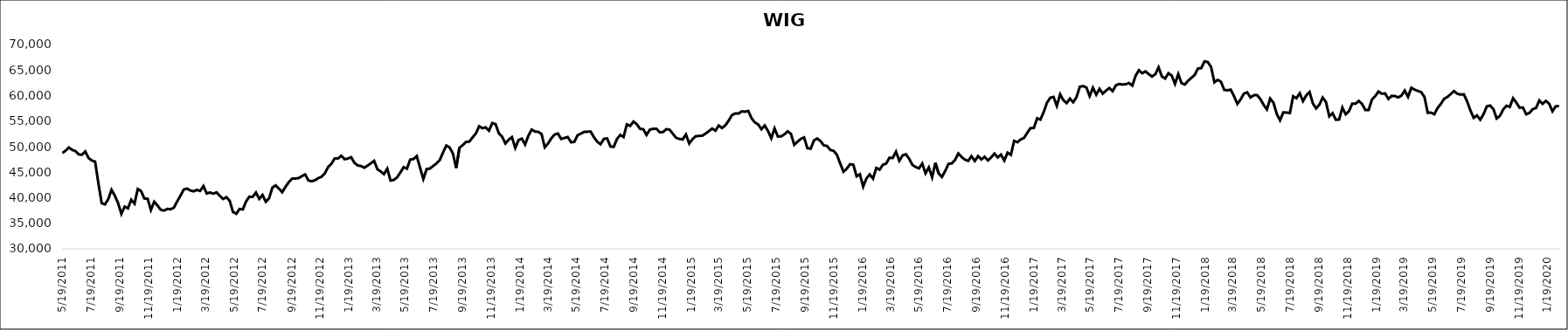
| Category | WIG |
|---|---|
| 5/19/11 | 48747.55 |
| 5/26/11 | 49215.53 |
| 6/2/11 | 49824.93 |
| 6/9/11 | 49378.82 |
| 6/16/11 | 49129.21 |
| 6/23/11 | 48485.26 |
| 6/30/11 | 48414.36 |
| 7/7/11 | 49057.05 |
| 7/14/11 | 47768.38 |
| 7/21/11 | 47291.31 |
| 7/28/11 | 47071.4 |
| 8/4/11 | 42828.22 |
| 8/11/11 | 38934.71 |
| 8/18/11 | 38697.56 |
| 8/25/11 | 39715.27 |
| 9/1/11 | 41553.09 |
| 9/8/11 | 40405.17 |
| 9/15/11 | 38945 |
| 9/22/11 | 36851.2 |
| 9/29/11 | 38264.32 |
| 10/6/11 | 37915.03 |
| 10/13/11 | 39608.13 |
| 10/20/11 | 38835.92 |
| 10/27/11 | 41708.88 |
| 11/3/11 | 41313.92 |
| 11/10/11 | 39853.18 |
| 11/17/11 | 39797.19 |
| 11/24/11 | 37607.27 |
| 12/1/11 | 39215.21 |
| 12/8/11 | 38474.28 |
| 12/15/11 | 37637.47 |
| 12/22/11 | 37478.7 |
| 12/29/11 | 37814.52 |
| 1/5/12 | 37739.39 |
| 1/12/12 | 38062.87 |
| 1/19/12 | 39288.13 |
| 1/26/12 | 40392.48 |
| 2/2/12 | 41602.24 |
| 2/9/12 | 41792.46 |
| 2/16/12 | 41430.3 |
| 2/23/12 | 41258.14 |
| 3/1/12 | 41533.87 |
| 3/8/12 | 41337.97 |
| 3/15/12 | 42281.33 |
| 3/22/12 | 40834.43 |
| 3/29/12 | 41028.06 |
| 4/5/12 | 40802.41 |
| 4/12/12 | 41053.82 |
| 4/19/12 | 40354.53 |
| 4/26/12 | 39761.78 |
| 5/3/12 | 40114.73 |
| 5/10/12 | 39404.16 |
| 5/17/12 | 37228.88 |
| 5/24/12 | 36852.75 |
| 5/31/12 | 37793.58 |
| 6/7/12 | 37707.25 |
| 6/14/12 | 39286.64 |
| 6/21/12 | 40207.61 |
| 6/28/12 | 40165.34 |
| 7/5/12 | 41013.96 |
| 7/12/12 | 39778.1 |
| 7/19/12 | 40545.64 |
| 7/26/12 | 39213.05 |
| 8/2/12 | 39876.95 |
| 8/9/12 | 41976.63 |
| 8/16/12 | 42408.41 |
| 8/23/12 | 41795.63 |
| 8/30/12 | 41077.44 |
| 9/6/12 | 42134.93 |
| 9/13/12 | 43047.41 |
| 9/20/12 | 43737.02 |
| 9/27/12 | 43763.3 |
| 10/4/12 | 43840.23 |
| 10/11/12 | 44224.67 |
| 10/18/12 | 44550.12 |
| 10/25/12 | 43374.6 |
| 11/1/12 | 43232.44 |
| 11/8/12 | 43429.42 |
| 11/15/12 | 43845.94 |
| 11/22/12 | 44121.53 |
| 11/29/12 | 44787.84 |
| 12/6/12 | 46019.97 |
| 12/13/12 | 46653.84 |
| 12/20/12 | 47701.82 |
| 12/27/12 | 47673.03 |
| 1/3/13 | 48222.72 |
| 1/10/13 | 47546.91 |
| 1/17/13 | 47661.37 |
| 1/24/13 | 47942.04 |
| 1/31/13 | 46840.15 |
| 2/7/13 | 46329.66 |
| 2/14/13 | 46211.54 |
| 2/21/13 | 45879.9 |
| 2/28/13 | 46280.36 |
| 3/7/13 | 46745.26 |
| 3/14/13 | 47223.68 |
| 3/21/13 | 45580.47 |
| 3/28/13 | 45147.57 |
| 4/4/13 | 44623.89 |
| 4/11/13 | 45688.48 |
| 4/18/13 | 43364.7 |
| 4/25/13 | 43482.18 |
| 5/2/13 | 43991.51 |
| 5/9/13 | 44943.16 |
| 5/16/13 | 45992.03 |
| 5/23/13 | 45687.76 |
| 5/30/13 | 47476.64 |
| 6/6/13 | 47573.66 |
| 6/13/13 | 48152.82 |
| 6/20/13 | 45870 |
| 6/27/13 | 43667.37 |
| 7/4/13 | 45613.75 |
| 7/11/13 | 45712.72 |
| 7/18/13 | 46221.23 |
| 7/25/13 | 46713.02 |
| 8/1/13 | 47370.81 |
| 8/8/13 | 48862.88 |
| 8/15/13 | 50223.95 |
| 8/22/13 | 49846.48 |
| 8/29/13 | 48676.45 |
| 9/5/13 | 45830.66 |
| 9/12/13 | 49771.55 |
| 9/19/13 | 50300.53 |
| 9/26/13 | 50936.34 |
| 10/3/13 | 50982.03 |
| 10/10/13 | 51806.83 |
| 10/17/13 | 52573.59 |
| 10/24/13 | 53994.46 |
| 10/31/13 | 53607.86 |
| 11/7/13 | 53785.07 |
| 11/14/13 | 53127.16 |
| 11/21/13 | 54621.21 |
| 11/28/13 | 54420.19 |
| 12/5/13 | 52597.13 |
| 12/12/13 | 51947.96 |
| 12/19/13 | 50631.75 |
| 12/26/13 | 51362.3 |
| 1/2/14 | 51865.89 |
| 1/9/14 | 49753.03 |
| 1/16/14 | 51288.7 |
| 1/23/14 | 51569.21 |
| 1/30/14 | 50417.17 |
| 2/6/14 | 52138.87 |
| 2/13/14 | 53349.65 |
| 2/20/14 | 52967.02 |
| 2/27/14 | 52906.04 |
| 3/6/14 | 52487.84 |
| 3/13/14 | 49878.65 |
| 3/20/14 | 50627.71 |
| 3/27/14 | 51642.99 |
| 4/3/14 | 52376.18 |
| 4/10/14 | 52580.73 |
| 4/17/14 | 51510.98 |
| 4/24/14 | 51705.76 |
| 5/1/14 | 51892.77 |
| 5/8/14 | 50851.25 |
| 5/15/14 | 50944.5 |
| 5/22/14 | 52244.13 |
| 5/29/14 | 52553.48 |
| 6/5/14 | 52901.29 |
| 6/12/14 | 52927.91 |
| 6/19/14 | 52937.45 |
| 6/26/14 | 51815.43 |
| 7/3/14 | 50951.73 |
| 7/10/14 | 50474.36 |
| 7/17/14 | 51527.37 |
| 7/24/14 | 51613.47 |
| 7/31/14 | 50037.12 |
| 8/7/14 | 49958.67 |
| 8/14/14 | 51512.57 |
| 8/21/14 | 52294.93 |
| 8/28/14 | 51882.01 |
| 9/4/14 | 54358.49 |
| 9/11/14 | 54065.27 |
| 9/18/14 | 54906.1 |
| 9/25/14 | 54411.77 |
| 10/2/14 | 53498.77 |
| 10/9/14 | 53416.03 |
| 10/16/14 | 52297.79 |
| 10/23/14 | 53335.43 |
| 10/30/14 | 53492 |
| 11/6/14 | 53512.14 |
| 11/13/14 | 52816.35 |
| 11/20/14 | 52848.54 |
| 11/27/14 | 53415.63 |
| 12/4/14 | 53346.86 |
| 12/11/14 | 52550.03 |
| 12/18/14 | 51739.04 |
| 12/25/14 | 51511.68 |
| 1/1/15 | 51416.08 |
| 1/8/15 | 52391 |
| 1/15/15 | 50616.63 |
| 1/22/15 | 51484.81 |
| 1/29/15 | 52040.24 |
| 2/5/15 | 52107.26 |
| 2/12/15 | 52139.81 |
| 2/19/15 | 52572.95 |
| 2/26/15 | 53042.6 |
| 3/5/15 | 53546.4 |
| 3/12/15 | 53136.13 |
| 3/19/15 | 54148.48 |
| 3/26/15 | 53649.9 |
| 4/2/15 | 54179.04 |
| 4/9/15 | 55063.85 |
| 4/16/15 | 56165.1 |
| 4/23/15 | 56492.95 |
| 4/30/15 | 56477.69 |
| 5/7/15 | 56911.34 |
| 5/14/15 | 56845.83 |
| 5/21/15 | 56990.6 |
| 5/28/15 | 55556.13 |
| 6/4/15 | 54749.74 |
| 6/11/15 | 54357.69 |
| 6/18/15 | 53408.53 |
| 6/25/15 | 54141.2 |
| 7/2/15 | 53074.71 |
| 7/9/15 | 51658.71 |
| 7/16/15 | 53588.24 |
| 7/23/15 | 51986.22 |
| 7/30/15 | 52011.81 |
| 8/6/15 | 52418.07 |
| 8/13/15 | 52995.96 |
| 8/20/15 | 52508.32 |
| 8/27/15 | 50366.09 |
| 9/3/15 | 50977.06 |
| 9/10/15 | 51527.08 |
| 9/17/15 | 51801.58 |
| 9/24/15 | 49701.31 |
| 10/1/15 | 49593.95 |
| 10/8/15 | 51222.77 |
| 10/15/15 | 51599.62 |
| 10/22/15 | 51094.29 |
| 10/29/15 | 50262.68 |
| 11/5/15 | 50125.85 |
| 11/12/15 | 49358.2 |
| 11/19/15 | 49177.74 |
| 11/26/15 | 48418.14 |
| 12/3/15 | 46693.09 |
| 12/10/15 | 45093.65 |
| 12/17/15 | 45684.05 |
| 12/24/15 | 46564.08 |
| 12/31/15 | 46467.38 |
| 1/7/16 | 44195.91 |
| 1/14/16 | 44596.08 |
| 1/21/16 | 42180.3 |
| 1/28/16 | 43778.96 |
| 2/4/16 | 44557.64 |
| 2/11/16 | 43741.96 |
| 2/18/16 | 45834.88 |
| 2/25/16 | 45497.77 |
| 3/3/16 | 46448.27 |
| 3/10/16 | 46686.74 |
| 3/17/16 | 47833.39 |
| 3/24/16 | 47778.01 |
| 3/31/16 | 49017.35 |
| 4/7/16 | 47231.36 |
| 4/14/16 | 48285.21 |
| 4/21/16 | 48514.39 |
| 4/28/16 | 47643.7 |
| 5/5/16 | 46430.16 |
| 5/12/16 | 46022.02 |
| 5/19/16 | 45751.68 |
| 5/26/16 | 46695.37 |
| 6/2/16 | 44772.72 |
| 6/9/16 | 45940.12 |
| 6/16/16 | 44007.81 |
| 6/23/16 | 46826.85 |
| 6/30/16 | 44748.53 |
| 7/7/16 | 44077.16 |
| 7/14/16 | 45246.26 |
| 7/21/16 | 46639.17 |
| 7/28/16 | 46718.98 |
| 8/4/16 | 47407.09 |
| 8/11/16 | 48675.96 |
| 8/18/16 | 47967.07 |
| 8/25/16 | 47464.07 |
| 9/1/16 | 47221.32 |
| 9/8/16 | 48129.15 |
| 9/15/16 | 47198.39 |
| 9/22/16 | 48154.88 |
| 9/29/16 | 47494.62 |
| 10/6/16 | 48014.44 |
| 10/13/16 | 47303.15 |
| 10/20/16 | 47894.17 |
| 10/27/16 | 48651.28 |
| 11/3/16 | 47899.61 |
| 11/10/16 | 48447.59 |
| 11/17/16 | 47274.21 |
| 11/24/16 | 48824.83 |
| 12/1/16 | 48404.21 |
| 12/8/16 | 51123.43 |
| 12/15/16 | 50881.35 |
| 12/22/16 | 51423.71 |
| 12/29/16 | 51703.91 |
| 1/5/17 | 52721.67 |
| 1/12/17 | 53650.94 |
| 1/19/17 | 53654.99 |
| 1/26/17 | 55560.23 |
| 2/2/17 | 55303.11 |
| 2/9/17 | 56785.52 |
| 2/16/17 | 58610.28 |
| 2/23/17 | 59583.89 |
| 3/2/17 | 59743.64 |
| 3/9/17 | 57986.6 |
| 3/16/17 | 60247.18 |
| 3/23/17 | 59093.68 |
| 3/30/17 | 58527.2 |
| 4/6/17 | 59406.36 |
| 4/13/17 | 58695.36 |
| 4/20/17 | 59700.07 |
| 4/27/17 | 61731.8 |
| 5/4/17 | 61862.8 |
| 5/11/17 | 61598.78 |
| 5/18/17 | 59901.12 |
| 5/25/17 | 61536.22 |
| 6/1/17 | 60181.96 |
| 6/8/17 | 61312.68 |
| 6/15/17 | 60381.07 |
| 6/22/17 | 60987.33 |
| 6/29/17 | 61475.96 |
| 7/6/17 | 60869.83 |
| 7/13/17 | 62018.68 |
| 7/20/17 | 62269.72 |
| 7/27/17 | 62171.7 |
| 8/3/17 | 62231.08 |
| 8/10/17 | 62451.57 |
| 8/17/17 | 61949.4 |
| 8/24/17 | 63886.54 |
| 8/31/17 | 64973.76 |
| 9/7/17 | 64381.87 |
| 9/14/17 | 64748.47 |
| 9/21/17 | 64209.19 |
| 9/28/17 | 63729.77 |
| 10/5/17 | 64185.71 |
| 10/12/17 | 65529.1 |
| 10/19/17 | 63745 |
| 10/26/17 | 63342.71 |
| 11/2/17 | 64375.83 |
| 11/9/17 | 63923.62 |
| 11/16/17 | 62299.29 |
| 11/23/17 | 64207.77 |
| 11/30/17 | 62440.31 |
| 12/7/17 | 62164.65 |
| 12/14/17 | 62916.39 |
| 12/21/17 | 63477.25 |
| 12/28/17 | 64053.47 |
| 1/4/18 | 65297.96 |
| 1/11/18 | 65379.88 |
| 1/18/18 | 66709.12 |
| 1/25/18 | 66561.79 |
| 2/1/18 | 65585.79 |
| 2/8/18 | 62604.89 |
| 2/15/18 | 63078.16 |
| 2/22/18 | 62717.27 |
| 3/1/18 | 61116.96 |
| 3/8/18 | 61036.99 |
| 3/15/18 | 61156.91 |
| 3/22/18 | 59862.55 |
| 3/29/18 | 58377.42 |
| 4/5/18 | 59244.04 |
| 4/12/18 | 60393.23 |
| 4/19/18 | 60629.81 |
| 4/26/18 | 59628.04 |
| 5/3/18 | 60066.46 |
| 5/10/18 | 60091.26 |
| 5/17/18 | 59337.27 |
| 5/24/18 | 58189.49 |
| 5/31/18 | 57282.73 |
| 6/7/18 | 59412.76 |
| 6/14/18 | 58603.93 |
| 6/21/18 | 56425.25 |
| 6/28/18 | 55169.77 |
| 7/5/18 | 56719.88 |
| 7/12/18 | 56671.44 |
| 7/19/18 | 56585.5 |
| 7/26/18 | 59871.2 |
| 8/2/18 | 59484.35 |
| 8/9/18 | 60455.75 |
| 8/16/18 | 58921.44 |
| 8/23/18 | 60044.45 |
| 8/30/18 | 60690.32 |
| 9/6/18 | 58469.6 |
| 9/13/18 | 57493.38 |
| 9/20/18 | 58231.57 |
| 9/27/18 | 59616.27 |
| 10/4/18 | 58736.08 |
| 10/11/18 | 55941.06 |
| 10/18/18 | 56560.93 |
| 10/25/18 | 55271.63 |
| 11/1/18 | 55312.71 |
| 11/8/18 | 57655.73 |
| 11/15/18 | 56329.01 |
| 11/22/18 | 56932.62 |
| 11/29/18 | 58412.94 |
| 12/6/18 | 58409.09 |
| 12/13/18 | 58952.55 |
| 12/20/18 | 58349.03 |
| 12/27/18 | 57183.28 |
| 1/3/19 | 57192.42 |
| 1/10/19 | 59219.23 |
| 1/17/19 | 59894.9 |
| 1/24/19 | 60791.02 |
| 1/31/19 | 60367.42 |
| 2/7/19 | 60422.38 |
| 2/14/19 | 59348.4 |
| 2/21/19 | 59938.07 |
| 2/28/19 | 59903.7 |
| 3/7/19 | 59638.3 |
| 3/14/19 | 60002.72 |
| 3/21/19 | 60976.51 |
| 3/28/19 | 59752.66 |
| 4/4/19 | 61533.27 |
| 4/11/19 | 61168.92 |
| 4/18/19 | 60910.11 |
| 4/25/19 | 60680.62 |
| 5/2/19 | 59744.3 |
| 5/9/19 | 56637.25 |
| 5/16/19 | 56664.5 |
| 5/23/19 | 56351.13 |
| 5/30/19 | 57566.83 |
| 6/6/19 | 58360.5 |
| 6/13/19 | 59374.38 |
| 6/20/19 | 59738.56 |
| 6/27/19 | 60293.37 |
| 7/4/19 | 60888.98 |
| 7/11/19 | 60362.11 |
| 7/18/19 | 60192.6 |
| 7/25/19 | 60249.72 |
| 8/1/19 | 58863.73 |
| 8/8/19 | 57102.69 |
| 8/15/19 | 55634.7 |
| 8/22/19 | 56118.92 |
| 8/29/19 | 55273.05 |
| 9/5/19 | 56358.3 |
| 9/12/19 | 57886.6 |
| 9/19/19 | 58053.03 |
| 9/26/19 | 57377.87 |
| 10/3/19 | 55523.06 |
| 10/10/19 | 56034.97 |
| 10/17/19 | 57297.12 |
| 10/24/19 | 58012.97 |
| 10/31/19 | 57783.02 |
| 11/7/19 | 59492.22 |
| 11/14/19 | 58622.1 |
| 11/21/19 | 57618.54 |
| 11/28/19 | 57669.94 |
| 12/5/19 | 56338.75 |
| 12/12/19 | 56621.06 |
| 12/19/19 | 57346.95 |
| 12/26/19 | 57569.71 |
| 1/2/20 | 59048.28 |
| 1/9/20 | 58397.17 |
| 1/16/20 | 58962.37 |
| 1/23/20 | 58401.85 |
| 1/30/20 | 56923.36 |
| 2/6/20 | 57900.04 |
| 2/13/20 | 57960.23 |